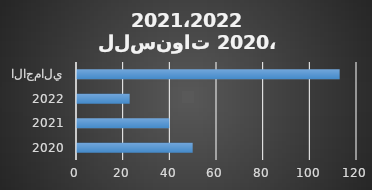
| Category | العدد |
|---|---|
| 2020 | 50 |
| 2021 | 40 |
| 2022 | 23 |
| الاجمالي | 113 |